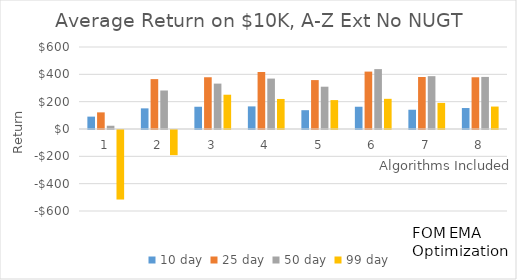
| Category | 10 day | 25 day | 50 day | 99 day |
|---|---|---|---|---|
| 1.0 | 90.543 | 121.694 | 23.859 | -508.762 |
| 2.0 | 151.004 | 365.017 | 281.799 | -184.087 |
| 3.0 | 162.833 | 378.694 | 332.206 | 250.825 |
| 4.0 | 165.379 | 417.109 | 368.9 | 219.802 |
| 5.0 | 137.673 | 357.856 | 309.521 | 211.532 |
| 6.0 | 162.858 | 420.043 | 438.166 | 220.798 |
| 7.0 | 140.899 | 380.66 | 386.601 | 190.971 |
| 8.0 | 153.454 | 378.546 | 381.079 | 164.234 |